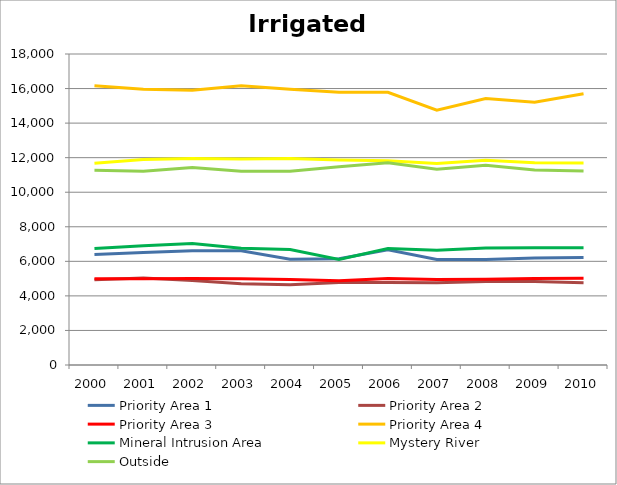
| Category | Priority Area 1 | Priority Area 2 | Priority Area 3 | Priority Area 4 | Mineral Intrusion Area | Mystery River | Outside |
|---|---|---|---|---|---|---|---|
| 2000.0 | 6402 | 4927 | 4990 | 16166 | 6748 | 11672 | 11278 |
| 2001.0 | 6515 | 5040 | 4987 | 15959 | 6908 | 11892 | 11220 |
| 2002.0 | 6615 | 4890 | 5001 | 15907 | 7027 | 11958 | 11425 |
| 2003.0 | 6609 | 4698 | 4990 | 16166 | 6757 | 11925 | 11215 |
| 2004.0 | 6117 | 4645 | 4948 | 15955 | 6687 | 11958 | 11211 |
| 2005.0 | 6147 | 4777 | 4875 | 15784 | 6107 | 11871 | 11469 |
| 2006.0 | 6663 | 4777 | 5004 | 15783 | 6745 | 11826 | 11702 |
| 2007.0 | 6103 | 4761 | 4954 | 14744 | 6648 | 11661 | 11330 |
| 2008.0 | 6103 | 4827 | 4964 | 15429 | 6775 | 11850 | 11567 |
| 2009.0 | 6197 | 4833 | 5008 | 15210 | 6786 | 11703 | 11293 |
| 2010.0 | 6221 | 4756 | 5017 | 15701 | 6781 | 11698 | 11231 |